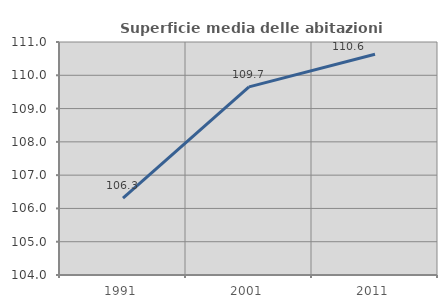
| Category | Superficie media delle abitazioni occupate |
|---|---|
| 1991.0 | 106.31 |
| 2001.0 | 109.651 |
| 2011.0 | 110.63 |